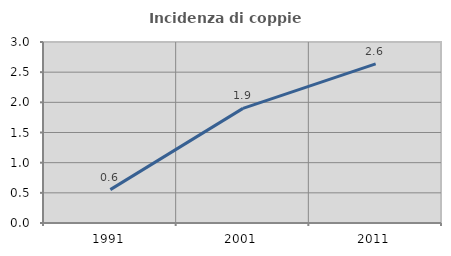
| Category | Incidenza di coppie miste |
|---|---|
| 1991.0 | 0.553 |
| 2001.0 | 1.9 |
| 2011.0 | 2.636 |